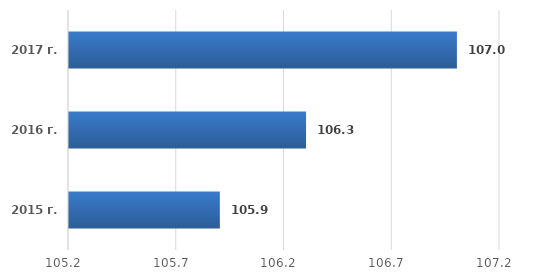
| Category | Series 0 |
|---|---|
| 2015 г. | 105.9 |
| 2016 г. | 106.3 |
| 2017 г. | 107 |